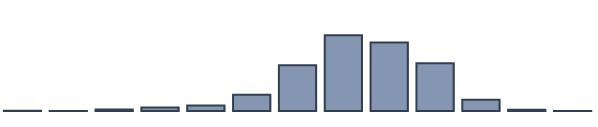
| Category | Series 0 |
|---|---|
| 0 | 0.13 |
| 1 | 0.043 |
| 2 | 0.565 |
| 3 | 1.217 |
| 4 | 2 |
| 5 | 5.87 |
| 6 | 16.478 |
| 7 | 27.261 |
| 8 | 24.652 |
| 9 | 17.174 |
| 10 | 4.087 |
| 11 | 0.478 |
| 12 | 0.043 |